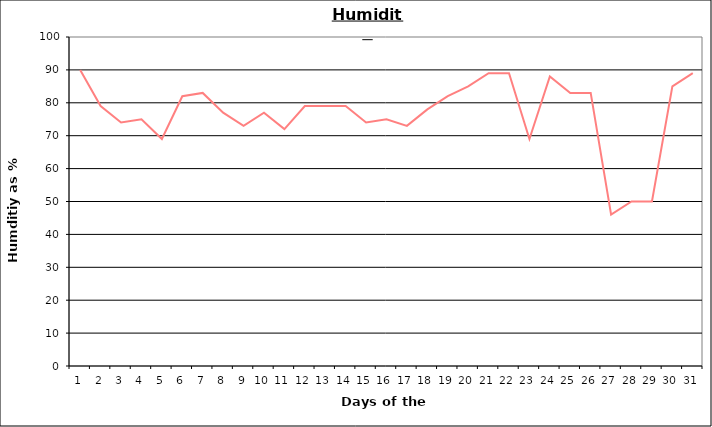
| Category | Series 0 |
|---|---|
| 0 | 90 |
| 1 | 79 |
| 2 | 74 |
| 3 | 75 |
| 4 | 69 |
| 5 | 82 |
| 6 | 83 |
| 7 | 77 |
| 8 | 73 |
| 9 | 77 |
| 10 | 72 |
| 11 | 79 |
| 12 | 79 |
| 13 | 79 |
| 14 | 74 |
| 15 | 75 |
| 16 | 73 |
| 17 | 78 |
| 18 | 82 |
| 19 | 85 |
| 20 | 89 |
| 21 | 89 |
| 22 | 69 |
| 23 | 88 |
| 24 | 83 |
| 25 | 83 |
| 26 | 46 |
| 27 | 50 |
| 28 | 50 |
| 29 | 85 |
| 30 | 89 |